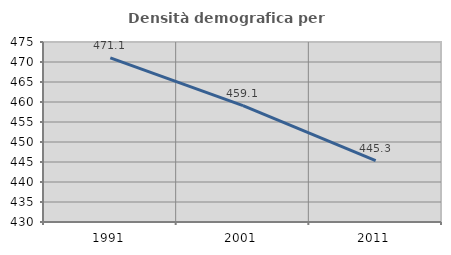
| Category | Densità demografica |
|---|---|
| 1991.0 | 471.052 |
| 2001.0 | 459.084 |
| 2011.0 | 445.33 |